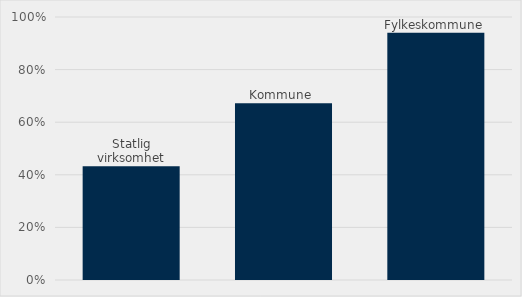
| Category | Estimert verdi som har krav til miljøledelsessystem |
|---|---|
| Statlig virksomhet | 0.432 |
| Kommune  | 0.672 |
| Fylkeskommune | 0.94 |